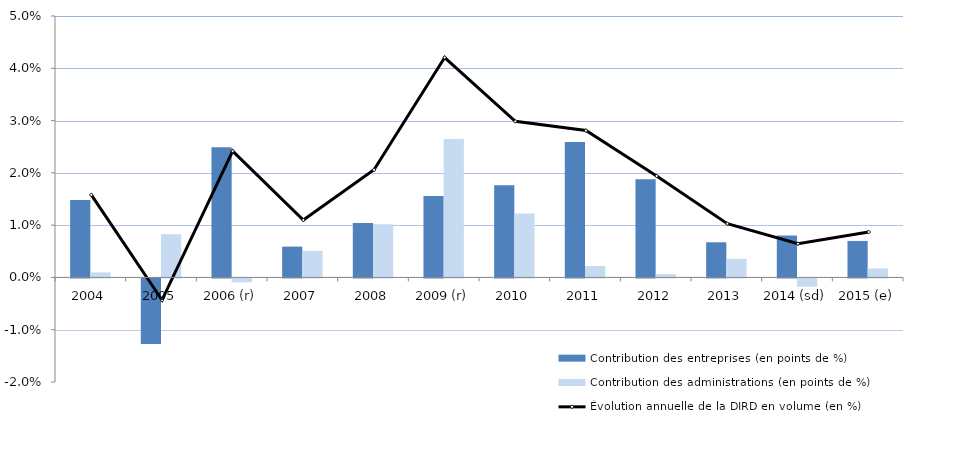
| Category | Contribution des entreprises (en points de %) | Contribution des administrations (en points de %) |
|---|---|---|
| 2004 | 0.015 | 0.001 |
| 2005 | -0.013 | 0.008 |
| 2006 (r) | 0.025 | -0.001 |
| 2007 | 0.006 | 0.005 |
| 2008 | 0.01 | 0.01 |
| 2009 (r) | 0.016 | 0.026 |
| 2010 | 0.018 | 0.012 |
| 2011 | 0.026 | 0.002 |
| 2012 | 0.019 | 0.001 |
| 2013 | 0.007 | 0.004 |
| 2014 (sd) | 0.008 | -0.002 |
| 2015 (e) | 0.007 | 0.002 |